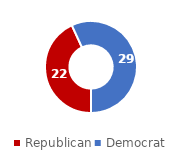
| Category | Series 0 |
|---|---|
| Republican | 22 |
| Democrat | 29 |